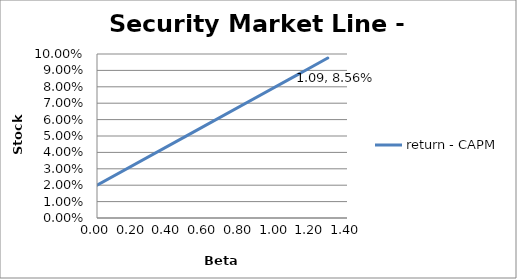
| Category | return - CAPM |
|---|---|
| 0.48628367012029283 | 0.049 |
| 1.1314755287716494 | 0.088 |
| 1.1990802298217815 | 0.092 |
| 0.0 | 0.02 |
| 1.0 | 0.08 |
| 1.0939982233265666 | 0.086 |